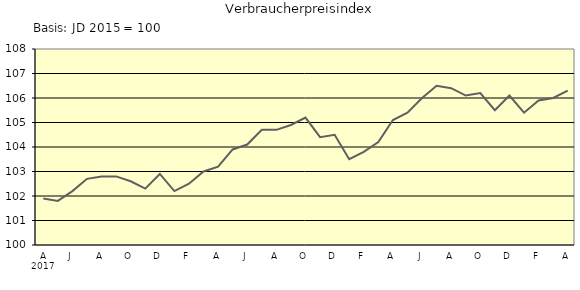
| Category | Series 0 |
|---|---|
| 0 | 101.9 |
| 1 | 101.8 |
| 2 | 102.2 |
| 3 | 102.7 |
| 4 | 102.8 |
| 5 | 102.8 |
| 6 | 102.6 |
| 7 | 102.3 |
| 8 | 102.9 |
| 9 | 102.2 |
| 10 | 102.5 |
| 11 | 103 |
| 12 | 103.2 |
| 13 | 103.9 |
| 14 | 104.1 |
| 15 | 104.7 |
| 16 | 104.7 |
| 17 | 104.9 |
| 18 | 105.2 |
| 19 | 104.4 |
| 20 | 104.5 |
| 21 | 103.5 |
| 22 | 103.8 |
| 23 | 104.2 |
| 24 | 105.1 |
| 25 | 105.4 |
| 26 | 106 |
| 27 | 106.5 |
| 28 | 106.4 |
| 29 | 106.1 |
| 30 | 106.2 |
| 31 | 105.5 |
| 32 | 106.1 |
| 33 | 105.4 |
| 34 | 105.9 |
| 35 | 106 |
| 36 | 106.3 |